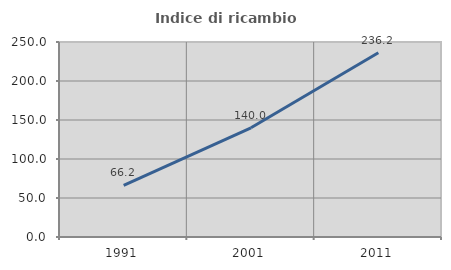
| Category | Indice di ricambio occupazionale  |
|---|---|
| 1991.0 | 66.197 |
| 2001.0 | 140 |
| 2011.0 | 236.17 |